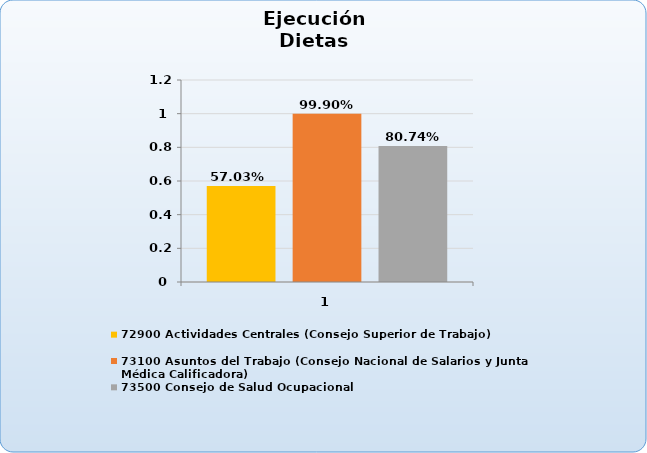
| Category | 72900 Actividades Centrales (Consejo Superior de Trabajo) | 73100 Asuntos del Trabajo (Consejo Nacional de Salarios y Junta Médica Calificadora) | 73500 Consejo de Salud Ocupacional  |
|---|---|---|---|
| 0 | 0.57 | 0.999 | 0.807 |